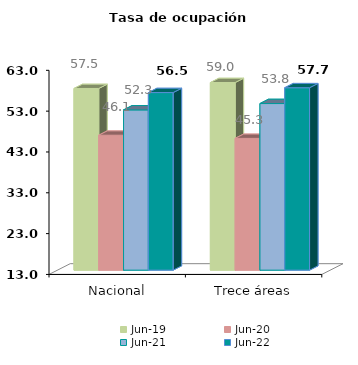
| Category | jun-19 | jun-20 | jun-21 | jun-22 |
|---|---|---|---|---|
| Nacional | 57.502 | 46.052 | 52.254 | 56.503 |
| Trece áreas | 58.954 | 45.276 | 53.811 | 57.686 |